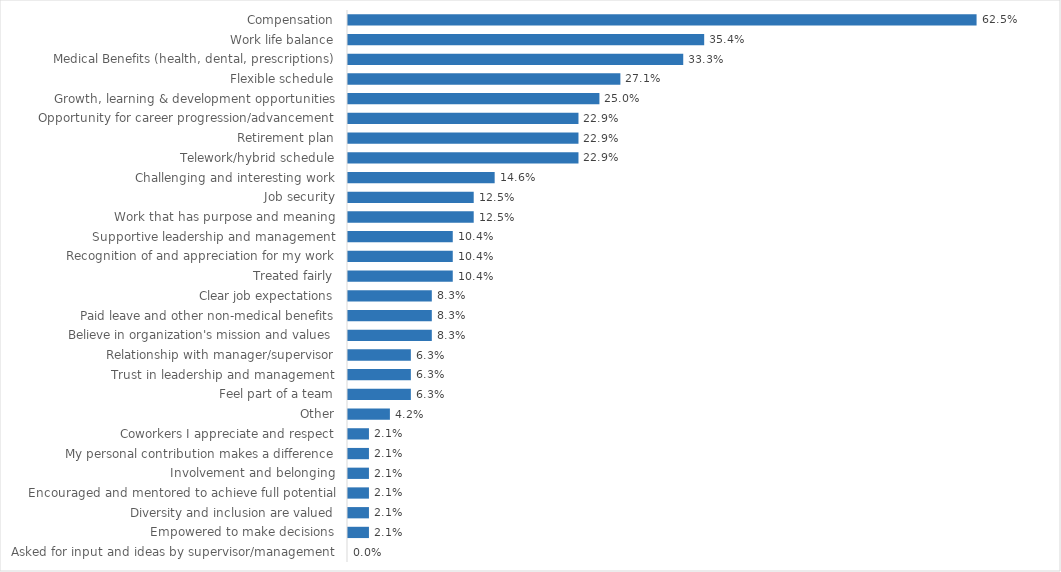
| Category | Secretary of State |
|---|---|
| Compensation | 0.625 |
| Work life balance | 0.354 |
| Medical Benefits (health, dental, prescriptions) | 0.333 |
| Flexible schedule | 0.271 |
| Growth, learning & development opportunities | 0.25 |
| Opportunity for career progression/advancement | 0.229 |
| Retirement plan | 0.229 |
| Telework/hybrid schedule | 0.229 |
| Challenging and interesting work | 0.146 |
| Job security | 0.125 |
| Work that has purpose and meaning | 0.125 |
| Supportive leadership and management | 0.104 |
| Recognition of and appreciation for my work | 0.104 |
| Treated fairly | 0.104 |
| Clear job expectations | 0.083 |
| Paid leave and other non-medical benefits | 0.083 |
| Believe in organization's mission and values | 0.083 |
| Relationship with manager/supervisor | 0.062 |
| Trust in leadership and management | 0.062 |
| Feel part of a team | 0.062 |
| Other | 0.042 |
| Coworkers I appreciate and respect | 0.021 |
| My personal contribution makes a difference | 0.021 |
| Involvement and belonging | 0.021 |
| Encouraged and mentored to achieve full potential | 0.021 |
| Diversity and inclusion are valued | 0.021 |
| Empowered to make decisions | 0.021 |
| Asked for input and ideas by supervisor/management | 0 |